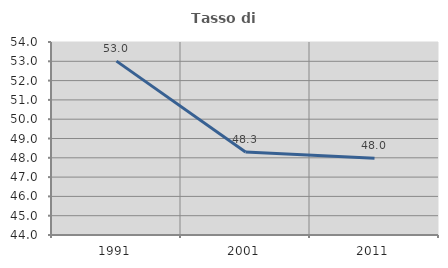
| Category | Tasso di occupazione   |
|---|---|
| 1991.0 | 53.009 |
| 2001.0 | 48.298 |
| 2011.0 | 47.98 |